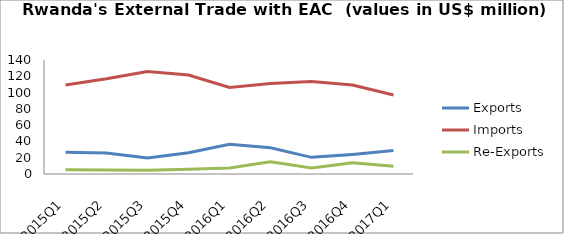
| Category | Exports | Imports | Re-Exports |
|---|---|---|---|
| 2015Q1 | 26.831 | 109.19 | 5.342 |
| 2015Q2 | 25.726 | 116.975 | 4.792 |
| 2015Q3 | 19.654 | 125.948 | 4.643 |
| 2015Q4 | 26.132 | 121.64 | 5.76 |
| 2016Q1 | 36.445 | 106.236 | 7.434 |
| 2016Q2 | 32.158 | 111.171 | 15.106 |
| 2016Q3 | 20.45 | 113.623 | 7.24 |
| 2016Q4 | 24.092 | 109.185 | 13.685 |
| 2017Q1 | 28.787 | 97.035 | 9.508 |